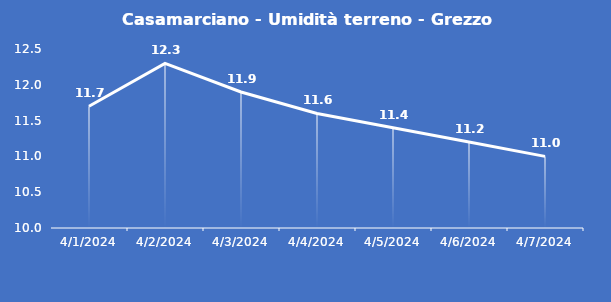
| Category | Casamarciano - Umidità terreno - Grezzo (%VWC) |
|---|---|
| 4/1/24 | 11.7 |
| 4/2/24 | 12.3 |
| 4/3/24 | 11.9 |
| 4/4/24 | 11.6 |
| 4/5/24 | 11.4 |
| 4/6/24 | 11.2 |
| 4/7/24 | 11 |